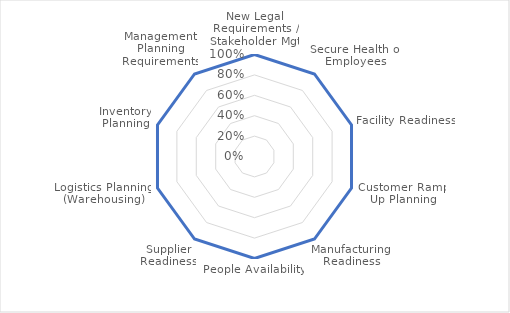
| Category | Series 0 | Series 1 |
|---|---|---|
| New Legal Requirements / Stakeholder Mgt | 1 | 0 |
| Secure Health of Employees | 1 | 0 |
| Facility Readiness | 1 | 0 |
| Customer Ramp Up Planning | 1 | 0 |
| Manufacturing Readiness | 1 | 0 |
| People Availability | 1 | 0 |
| Supplier Readiness | 1 | 0 |
| Logistics Planning (Warehousing) | 1 | 0 |
| Inventory Planning | 1 | 0 |
| Management Planning Requirements | 1 | 0 |